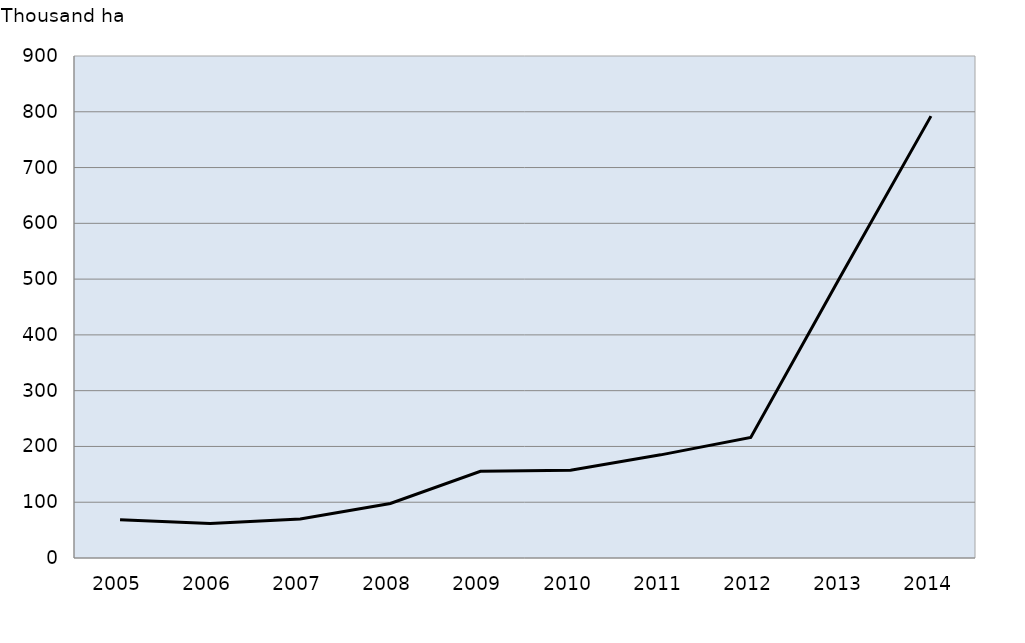
| Category | Area, ha '000 |
|---|---|
| 2005.0 | 68.602 |
| 2006.0 | 61.953 |
| 2007.0 | 70.036 |
| 2008.0 | 97.784 |
| 2009.0 | 155.488 |
| 2010.0 | 157.444 |
| 2011.0 | 184.926 |
| 2012.0 | 216.193 |
| 2013.0 | 506.027 |
| 2014.0 | 792.208 |